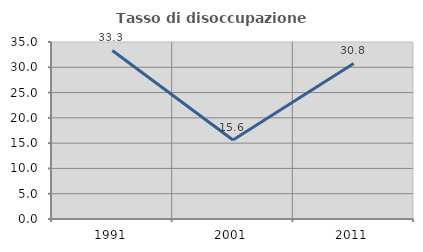
| Category | Tasso di disoccupazione giovanile  |
|---|---|
| 1991.0 | 33.333 |
| 2001.0 | 15.625 |
| 2011.0 | 30.769 |